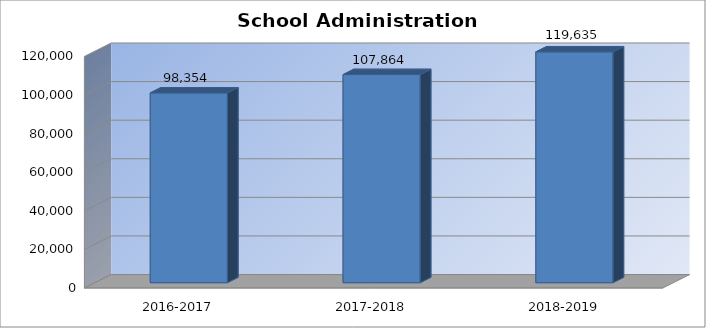
| Category | School Administration Expenditures |
|---|---|
| 2016-2017 | 98354 |
| 2017-2018 | 107864 |
| 2018-2019 | 119635 |